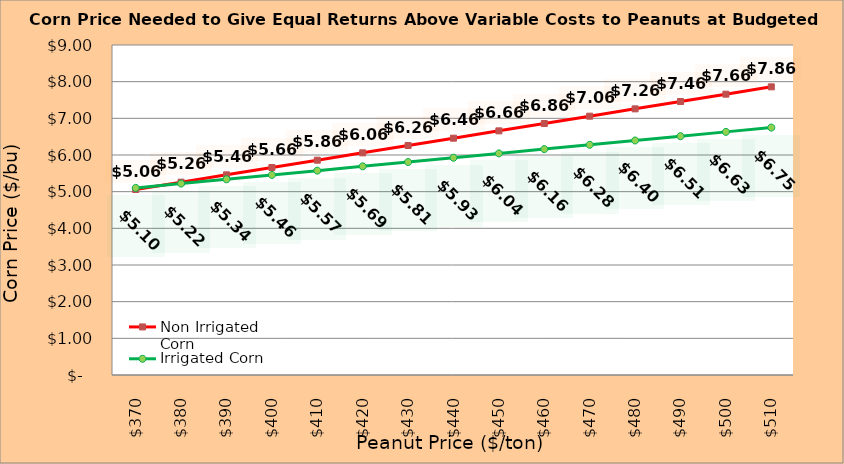
| Category | Non Irrigated Corn | Irrigated Corn |
|---|---|---|
| 370.0 | 5.059 | 5.103 |
| 380.0 | 5.259 | 5.221 |
| 390.0 | 5.459 | 5.338 |
| 400.0 | 5.659 | 5.456 |
| 410.0 | 5.859 | 5.573 |
| 420.0 | 6.059 | 5.691 |
| 430.0 | 6.259 | 5.808 |
| 440.0 | 6.459 | 5.926 |
| 450.0 | 6.659 | 6.043 |
| 460.0 | 6.859 | 6.161 |
| 470.0 | 7.059 | 6.278 |
| 480.0 | 7.259 | 6.396 |
| 490.0 | 7.459 | 6.513 |
| 500.0 | 7.659 | 6.631 |
| 510.0 | 7.859 | 6.748 |